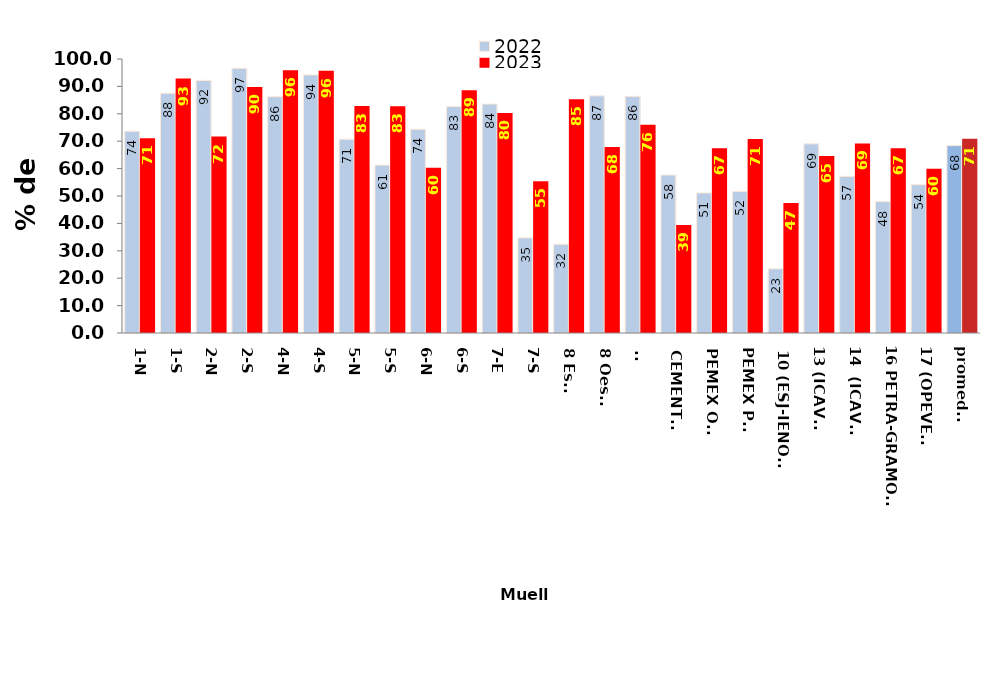
| Category | 2022 | 2023 |
|---|---|---|
| 1-N | 73.627 | 71.07 |
| 1-S | 87.512 | 92.851 |
| 2-N | 92.197 | 71.708 |
| 2-S | 96.616 | 89.751 |
| 4-N | 86.245 | 95.874 |
| 4-S | 94.205 | 95.727 |
| 5-N | 70.721 | 82.82 |
| 5-S | 61.284 | 82.775 |
| 6-N | 74.37 | 60.345 |
| 6-S | 82.67 | 88.551 |
| 7-E | 83.56 | 80.311 |
| 7-S | 34.722 | 55.401 |
| 8 Este | 32.396 | 85.269 |
| 8 Oeste | 86.55 | 67.881 |
| 9- | 86.368 | 76.013 |
| CEMENTOS | 57.66 | 39.414 |
| PEMEX OTE | 51.119 | 67.425 |
| PEMEX PTE | 51.699 | 70.847 |
| 10 (ESJ-IENOVA) | 23.422 | 47.411 |
| 13 (ICAVE) | 69.038 | 64.634 |
| 14  (ICAVE) | 57.163 | 69.174 |
| 16 PETRA-GRAMOSA | 47.965 | 67.447 |
| 17 (OPEVER) | 54.142 | 59.926 |
| promedio | 68.399 | 70.889 |